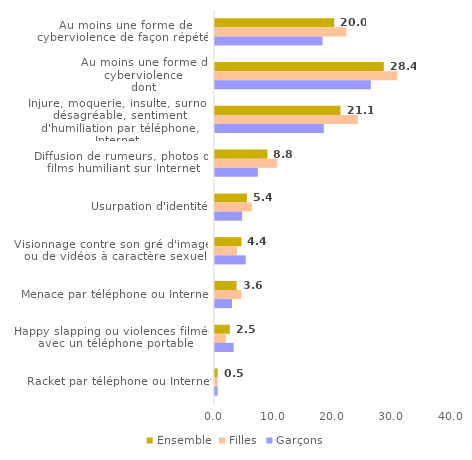
| Category | Ensemble | Filles | Garçons |
|---|---|---|---|
| Au moins une forme de cyberviolence de façon répétée | 20.022 | 22.048 | 18.07 |
| Au moins une forme de cyberviolence 
dont | 28.372 | 30.642 | 26.186 |
| Injure, moquerie, insulte, surnom désagréable, sentiment d'humiliation par téléphone, Internet | 21.093 | 24.004 | 18.286 |
| Diffusion de rumeurs, photos ou films humiliant sur Internet | 8.808 | 10.469 | 7.196 |
| Usurpation d'identité | 5.363 | 6.185 | 4.562 |
| Visionnage contre son gré d'images ou de vidéos à caractère sexuel | 4.445 | 3.701 | 5.174 |
| Menace par téléphone ou Internet | 3.624 | 4.404 | 2.865 |
| Happy slapping ou violences filmées avec un téléphone portable | 2.493 | 1.831 | 3.14 |
| Racket par téléphone ou Internet | 0.457 | 0.467 | 0.447 |